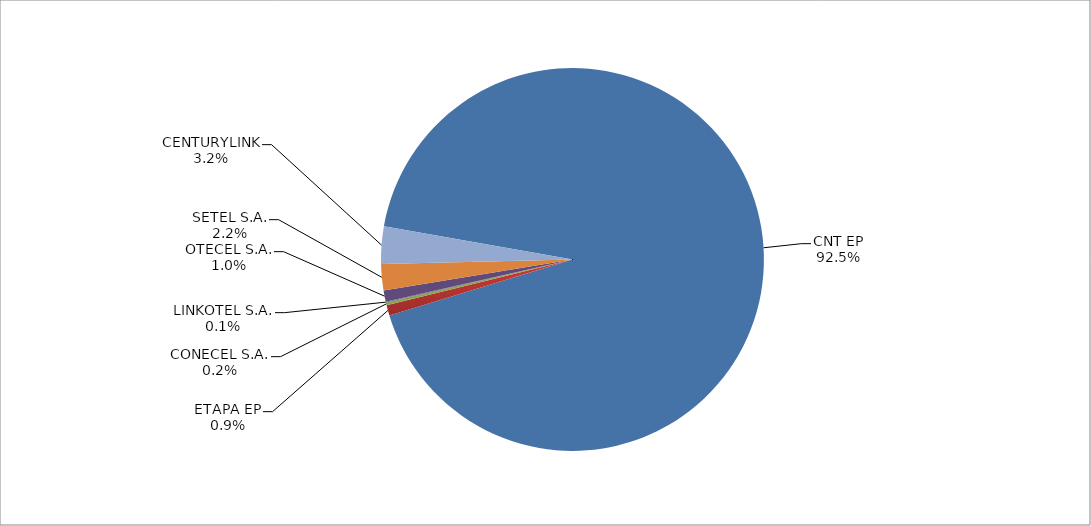
| Category | Series 0 |
|---|---|
| CNT EP | 2723 |
| ETAPA EP | 26 |
| CONECEL S.A. | 7 |
| LINKOTEL S.A. | 2 |
| OTECEL S.A. | 28 |
| SETEL S.A. | 65 |
| CENTURYLINK | 93 |